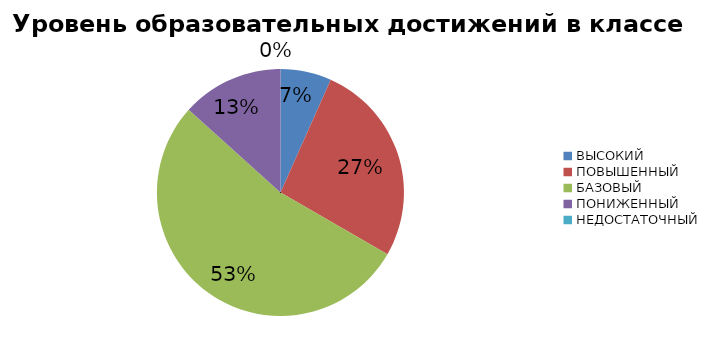
| Category | Series 0 |
|---|---|
| ВЫСОКИЙ | 6.667 |
| ПОВЫШЕННЫЙ | 26.667 |
| БАЗОВЫЙ | 53.333 |
| ПОНИЖЕННЫЙ | 13.333 |
| НЕДОСТАТОЧНЫЙ | 0 |